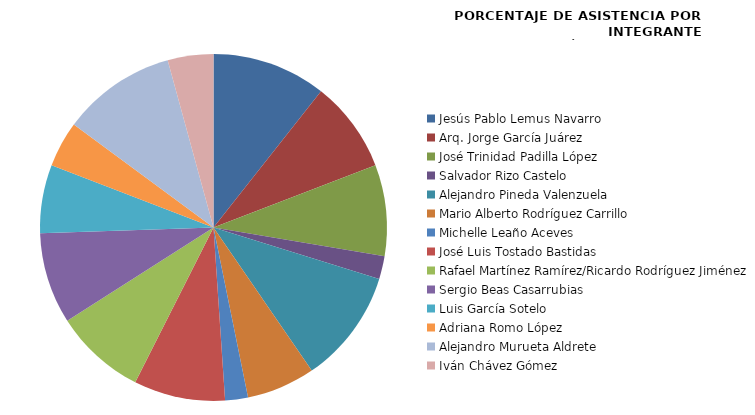
| Category | Series 0 |
|---|---|
| Jesús Pablo Lemus Navarro | 100 |
| Arq. Jorge García Juárez | 80 |
| José Trinidad Padilla López | 80 |
| Salvador Rizo Castelo | 20 |
| Alejandro Pineda Valenzuela | 100 |
| Mario Alberto Rodríguez Carrillo | 60 |
| Michelle Leaño Aceves | 20 |
| José Luis Tostado Bastidas | 80 |
| Rafael Martínez Ramírez/Ricardo Rodríguez Jiménez | 80 |
| Sergio Beas Casarrubias | 80 |
| Luis García Sotelo | 60 |
| Adriana Romo López | 40 |
| Alejandro Murueta Aldrete | 100 |
| Iván Chávez Gómez | 40 |